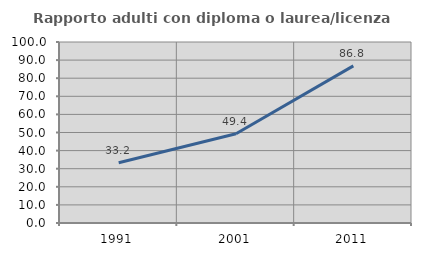
| Category | Rapporto adulti con diploma o laurea/licenza media  |
|---|---|
| 1991.0 | 33.244 |
| 2001.0 | 49.351 |
| 2011.0 | 86.827 |